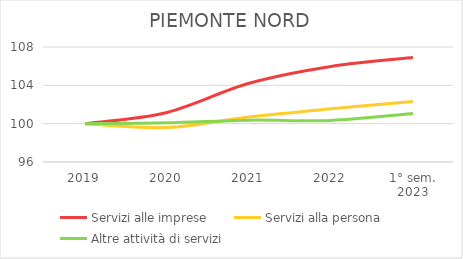
| Category | Servizi alle imprese | Servizi alla persona | Altre attività di servizi |
|---|---|---|---|
| 2019 | 100 | 100 | 100 |
| 2020 | 101.172 | 99.599 | 100.083 |
| 2021 | 104.211 | 100.701 | 100.369 |
| 2022 | 105.969 | 101.552 | 100.341 |
| 1° sem.
2023 | 106.895 | 102.303 | 101.052 |